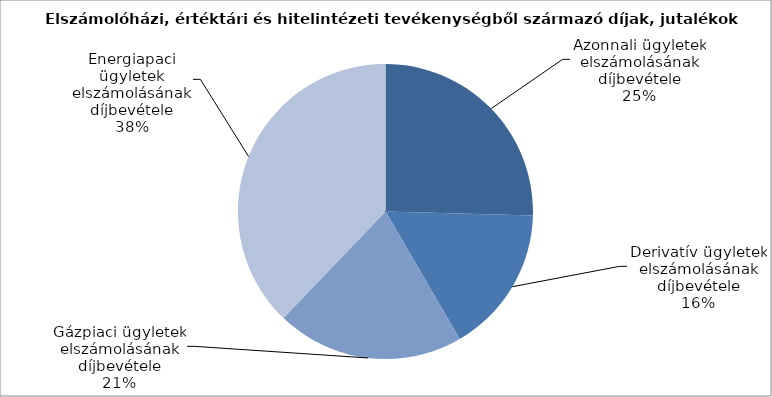
| Category | Series 0 |
|---|---|
| Azonnali ügyletek elszámolásának díjbevétele | 347.695 |
| Derivatív ügyletek elszámolásának díjbevétele | 221.169 |
| Gázpiaci ügyletek elszámolásának díjbevétele | 281.016 |
| Energiapaci ügyletek elszámolásának díjbevétele | 517.518 |